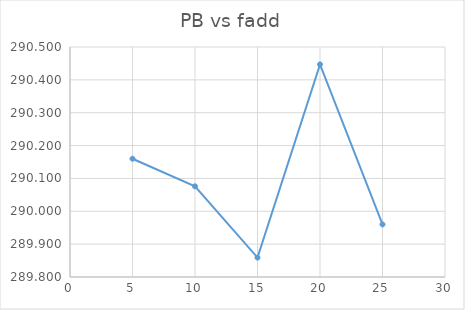
| Category | PB |
|---|---|
| 5.0 | 290.16 |
| 10.0 | 290.076 |
| 15.0 | 289.859 |
| 20.0 | 290.447 |
| 25.0 | 289.96 |